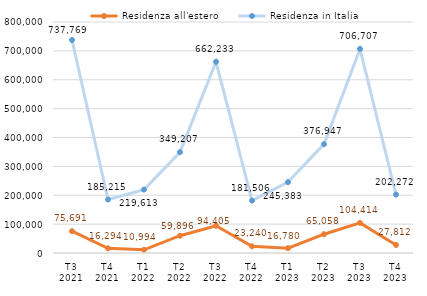
| Category | Residenza all'estero | Residenza in Italia |
|---|---|---|
| T3
2021 | 75691 | 737769 |
| T4
2021 | 16294 | 185215 |
| T1
2022 | 10994 | 219613 |
| T2
2022 | 59896 | 349207 |
| T3
2022 | 94405 | 662233 |
| T4
2022 | 23240 | 181506 |
| T1
2023 | 16780 | 245383 |
| T2
2023 | 65058 | 376947 |
| T3
2023 | 104414 | 706707 |
| T4
2023 | 27812 | 202272 |